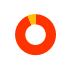
| Category | Series 0 |
|---|---|
| 0 | 45.53 |
| 1 | 3.099 |